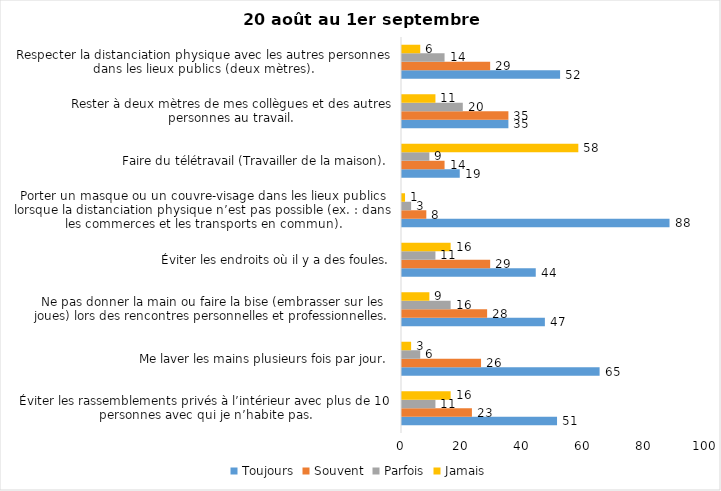
| Category | Toujours | Souvent | Parfois | Jamais |
|---|---|---|---|---|
| Éviter les rassemblements privés à l’intérieur avec plus de 10 personnes avec qui je n’habite pas. | 51 | 23 | 11 | 16 |
| Me laver les mains plusieurs fois par jour. | 65 | 26 | 6 | 3 |
| Ne pas donner la main ou faire la bise (embrasser sur les joues) lors des rencontres personnelles et professionnelles. | 47 | 28 | 16 | 9 |
| Éviter les endroits où il y a des foules. | 44 | 29 | 11 | 16 |
| Porter un masque ou un couvre-visage dans les lieux publics lorsque la distanciation physique n’est pas possible (ex. : dans les commerces et les transports en commun). | 88 | 8 | 3 | 1 |
| Faire du télétravail (Travailler de la maison). | 19 | 14 | 9 | 58 |
| Rester à deux mètres de mes collègues et des autres personnes au travail. | 35 | 35 | 20 | 11 |
| Respecter la distanciation physique avec les autres personnes dans les lieux publics (deux mètres). | 52 | 29 | 14 | 6 |